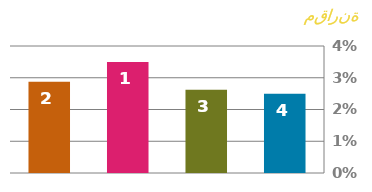
| Category | السعر |
|---|---|
| 0 | 0.025 |
| 1 | 0.026 |
| 2 | 0.035 |
| 3 | 0.029 |